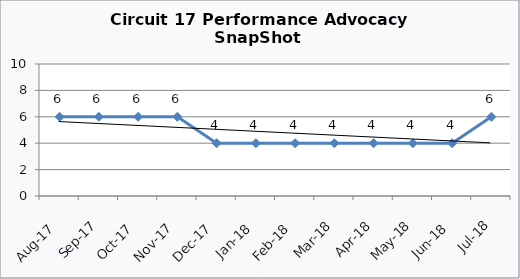
| Category | Circuit 17 |
|---|---|
| Aug-17 | 6 |
| Sep-17 | 6 |
| Oct-17 | 6 |
| Nov-17 | 6 |
| Dec-17 | 4 |
| Jan-18 | 4 |
| Feb-18 | 4 |
| Mar-18 | 4 |
| Apr-18 | 4 |
| May-18 | 4 |
| Jun-18 | 4 |
| Jul-18 | 6 |